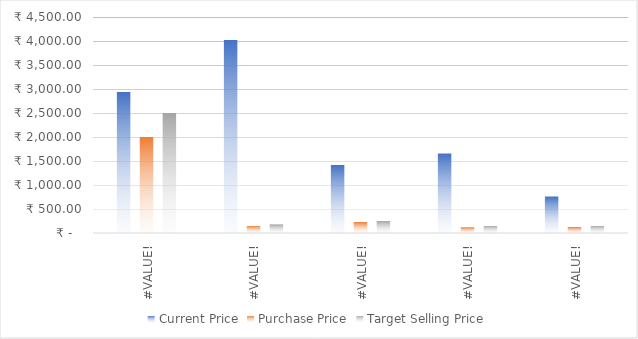
| Category | Current Price | Purchase Price | Target Selling Price |
|---|---|---|---|
| RELIANCE INDUSTRIES LIMITED (XNSE:RELIANCE) | 2937.8 | 2000 | 2500 |
| TATA CONSULTANCY SERVICES LIMITED (XNSE:TCS) | 4020.25 | 150 | 180 |
| HDFC BANK LIMITED (XNSE:HDFCBANK) | 1416.35 | 230 | 250 |
| INFOSYS LIMITED (XNSE:INFY) | 1657.1 | 120 | 150 |
| State Bank of India (XNSE:SBIN) | 760.55 | 125 | 150 |